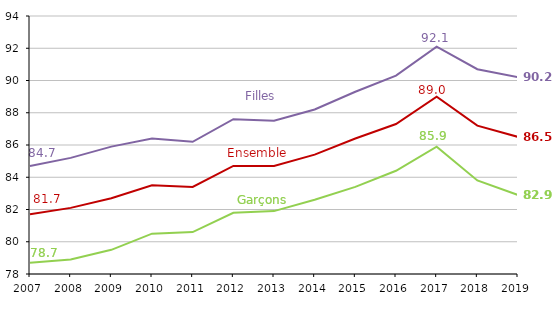
| Category | Garçons | Filles | Ensemble |
|---|---|---|---|
| 2007.0 | 78.7 | 84.7 | 81.7 |
| 2008.0 | 78.9 | 85.2 | 82.1 |
| 2009.0 | 79.5 | 85.9 | 82.7 |
| 2010.0 | 80.5 | 86.4 | 83.5 |
| 2011.0 | 80.6 | 86.2 | 83.4 |
| 2012.0 | 81.8 | 87.6 | 84.7 |
| 2013.0 | 81.9 | 87.5 | 84.7 |
| 2014.0 | 82.6 | 88.2 | 85.4 |
| 2015.0 | 83.4 | 89.3 | 86.4 |
| 2016.0 | 84.4 | 90.3 | 87.3 |
| 2017.0 | 85.9 | 92.1 | 89 |
| 2018.0 | 83.8 | 90.7 | 87.2 |
| 2019.0 | 82.9 | 90.2 | 86.5 |